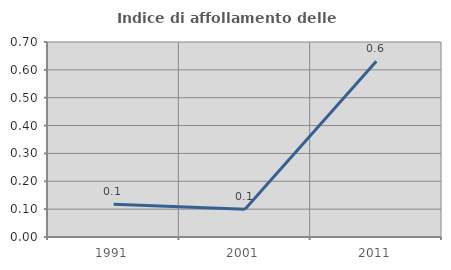
| Category | Indice di affollamento delle abitazioni  |
|---|---|
| 1991.0 | 0.118 |
| 2001.0 | 0.1 |
| 2011.0 | 0.631 |